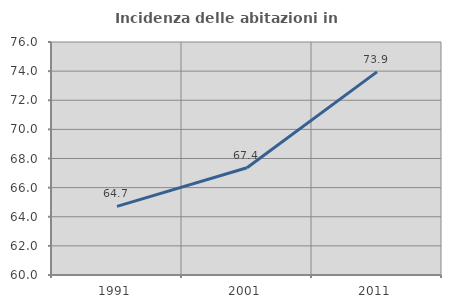
| Category | Incidenza delle abitazioni in proprietà  |
|---|---|
| 1991.0 | 64.712 |
| 2001.0 | 67.365 |
| 2011.0 | 73.946 |